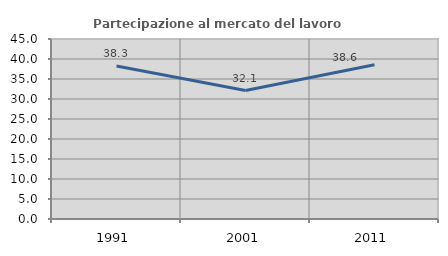
| Category | Partecipazione al mercato del lavoro  femminile |
|---|---|
| 1991.0 | 38.272 |
| 2001.0 | 32.117 |
| 2011.0 | 38.567 |